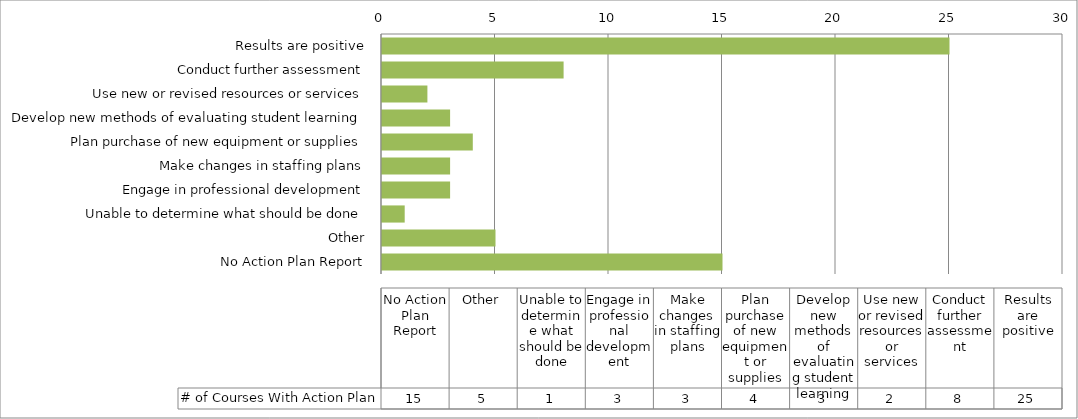
| Category | # of Courses With Action Plan |
|---|---|
| Results are positive | 25 |
| Conduct further assessment | 8 |
| Use new or revised resources or services | 2 |
| Develop new methods of evaluating student learning | 3 |
| Plan purchase of new equipment or supplies | 4 |
| Make changes in staffing plans | 3 |
| Engage in professional development | 3 |
| Unable to determine what should be done | 1 |
| Other | 5 |
| No Action Plan Report | 15 |